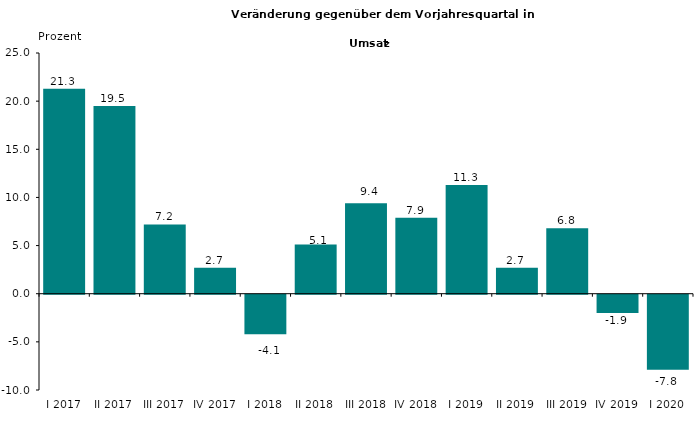
| Category | 21,3 |
|---|---|
| I 2017 | 21.3 |
| II 2017 | 19.5 |
| III 2017 | 7.2 |
| IV 2017 | 2.7 |
| I 2018 | -4.1 |
| II 2018 | 5.1 |
| III 2018 | 9.4 |
| IV 2018 | 7.9 |
| I 2019 | 11.3 |
| II 2019 | 2.7 |
| III 2019 | 6.8 |
| IV 2019 | -1.9 |
| I 2020 | -7.8 |